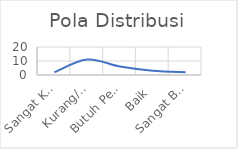
| Category | Pola Distribusi |
|---|---|
| Sangat Kurang | 2 |
| Kurang/Misconduct | 11 |
| Butuh Perbaikan | 6 |
| Baik | 3 |
| Sangat Baik | 2 |